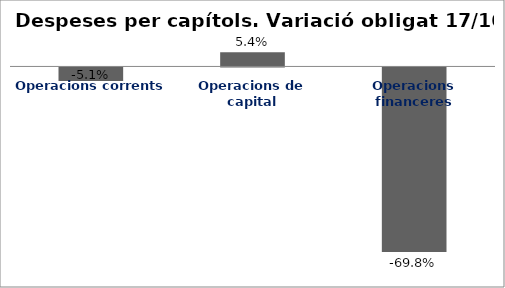
| Category | Series 0 |
|---|---|
| Operacions corrents | -0.051 |
| Operacions de capital | 0.054 |
| Operacions financeres | -0.698 |